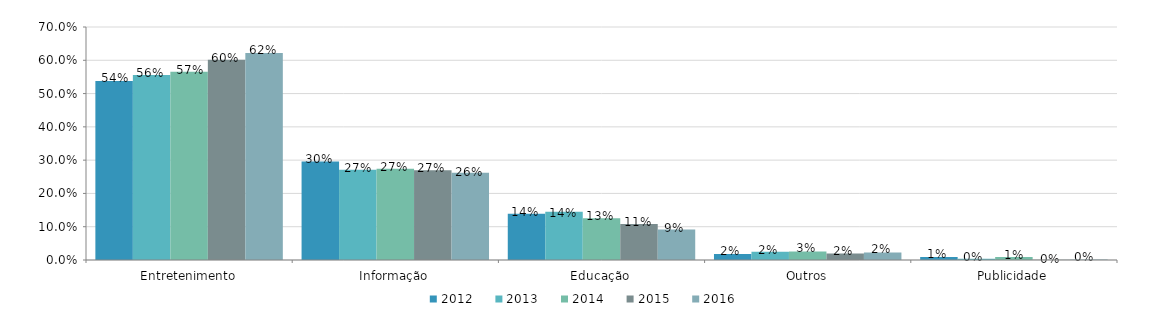
| Category | 2012 | 2013 | 2014 | 2015 | 2016 |
|---|---|---|---|---|---|
| Entretenimento | 0.538 | 0.556 | 0.566 | 0.602 | 0.622 |
| Informação | 0.296 | 0.271 | 0.274 | 0.27 | 0.262 |
| Educação | 0.139 | 0.145 | 0.125 | 0.108 | 0.092 |
| Outros | 0.018 | 0.025 | 0.026 | 0.019 | 0.023 |
| Publicidade | 0.009 | 0.004 | 0.009 | 0.001 | 0.002 |